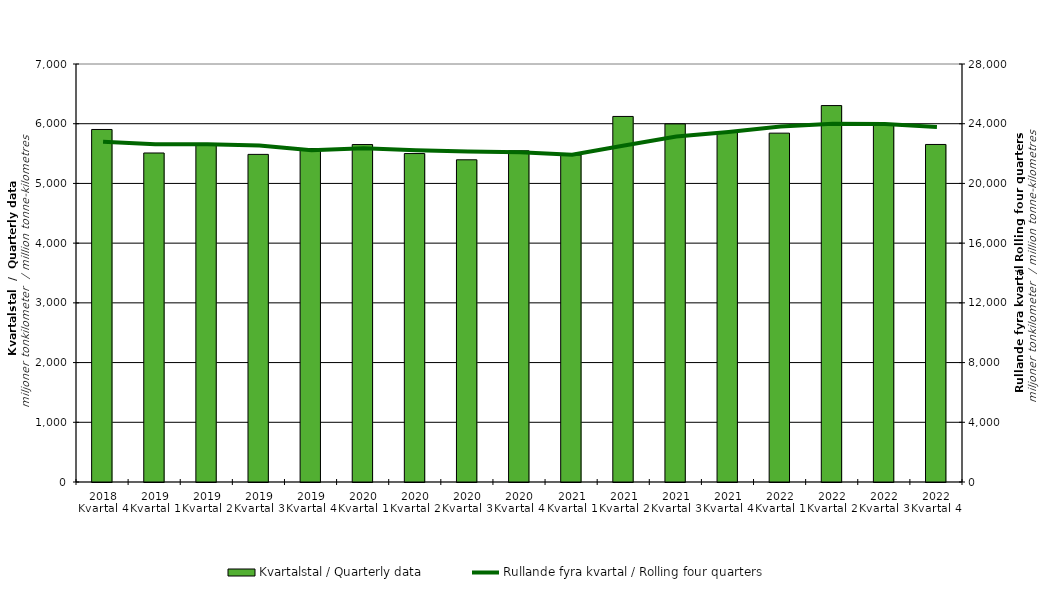
| Category | Kvartalstal / Quarterly data |
|---|---|
| 2018 Kvartal 4 | 5903.543 |
| 2019 Kvartal 1 | 5509.773 |
| 2019 Kvartal 2 | 5641.612 |
| 2019 Kvartal 3 | 5486.395 |
| 2019 Kvartal 4 | 5584.286 |
| 2020 Kvartal 1 | 5650.915 |
| 2020 Kvartal 2 | 5500.334 |
| 2020 Kvartal 3 | 5395.987 |
| 2020 Kvartal 4 | 5546.662 |
| 2021 Kvartal 1 | 5476.427 |
| 2021 Kvartal 2 | 6121.807 |
| 2021 Kvartal 3 | 5996.688 |
| 2021 Kvartal 4 | 5853.966 |
| 2022 Kvartal 1 | 5842.094 |
| 2022 Kvartal 2 | 6303.848 |
| 2022 Kvartal 3 | 5986.47 |
| 2022 Kvartal 4 | 5652.593 |